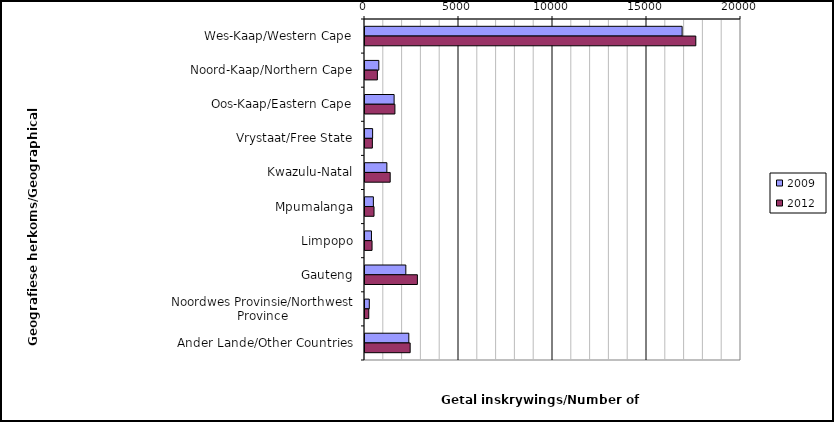
| Category | 2009 | 2012 |
|---|---|---|
| Wes-Kaap/Western Cape | 16869 | 17596 |
| Noord-Kaap/Northern Cape | 735 | 659 |
| Oos-Kaap/Eastern Cape | 1549 | 1591 |
| Vrystaat/Free State | 405 | 392 |
| Kwazulu-Natal | 1163 | 1340 |
| Mpumalanga | 446 | 480 |
| Limpopo | 344 | 375 |
| Gauteng | 2172 | 2787 |
| Noordwes Provinsie/Northwest Province | 229 | 201 |
| Ander Lande/Other Countries | 2331 | 2402 |